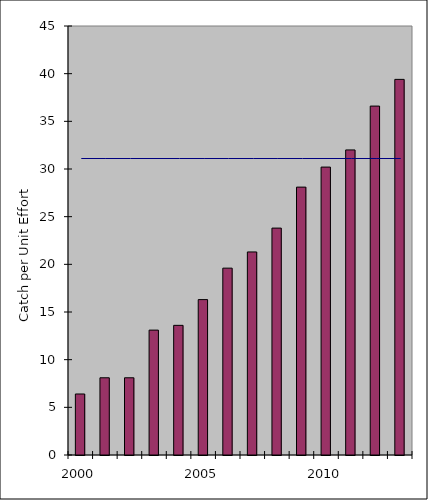
| Category | Geo Mean of Pound Net Data* (Walburg/Sykes) |
|---|---|
| 2000.0 | 6.4 |
| 2001.0 | 8.1 |
| 2002.0 | 8.1 |
| 2003.0 | 13.1 |
| 2004.0 | 13.6 |
| 2005.0 | 16.3 |
| 2006.0 | 19.6 |
| 2007.0 | 21.3 |
| 2008.0 | 23.8 |
| 2009.0 | 28.1 |
| 2010.0 | 30.2 |
| 2011.0 | 32 |
| 2012.0 | 36.6 |
| 2013.0 | 39.4 |